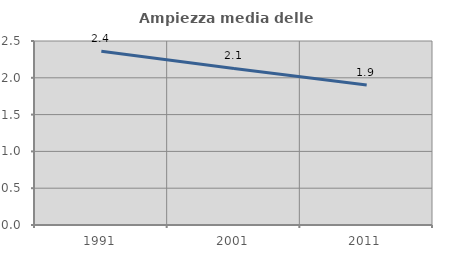
| Category | Ampiezza media delle famiglie |
|---|---|
| 1991.0 | 2.36 |
| 2001.0 | 2.126 |
| 2011.0 | 1.902 |